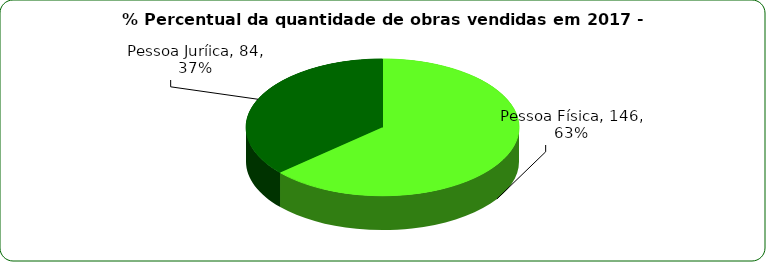
| Category | Series 0 |
|---|---|
| Pessoa Física | 146 |
| Pessoa Juríica | 84 |